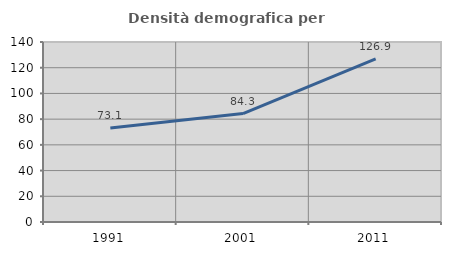
| Category | Densità demografica |
|---|---|
| 1991.0 | 73.116 |
| 2001.0 | 84.308 |
| 2011.0 | 126.865 |